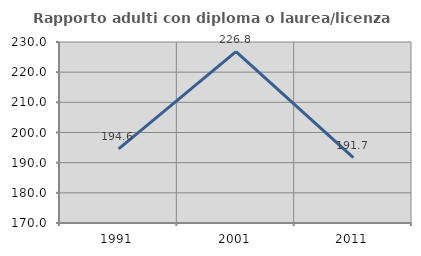
| Category | Rapporto adulti con diploma o laurea/licenza media  |
|---|---|
| 1991.0 | 194.595 |
| 2001.0 | 226.829 |
| 2011.0 | 191.667 |